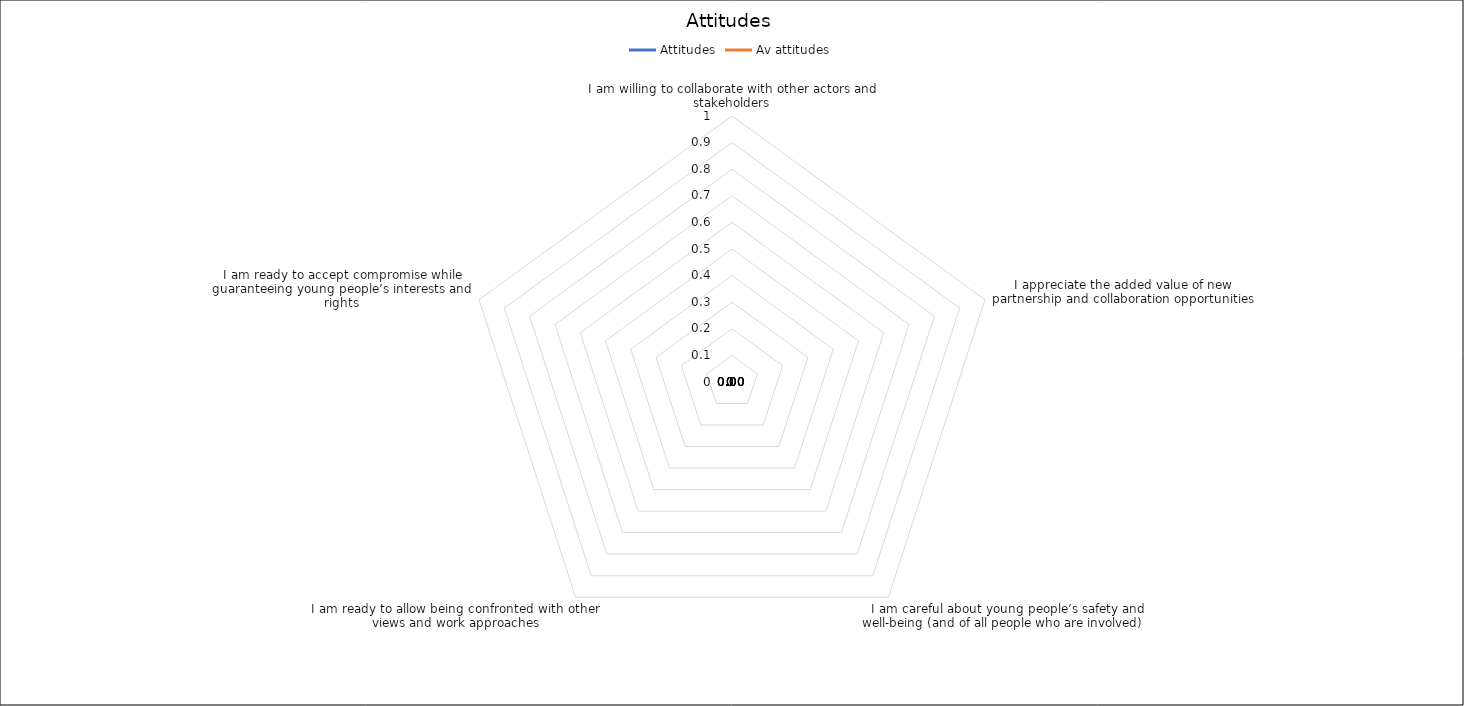
| Category | Attitudes | Av attitudes |
|---|---|---|
| I am willing to collaborate with other actors and stakeholders | 0 | 0 |
| I appreciate the added value of new partnership and collaboration opportunities | 0 | 0 |
| I am careful about young people’s safety and well-being (and of all people who are involved)   | 0 | 0 |
| I am ready to allow being confronted with other views and work approaches | 0 | 0 |
| I am ready to accept compromise while guaranteeing young people’s interests and rights | 0 | 0 |